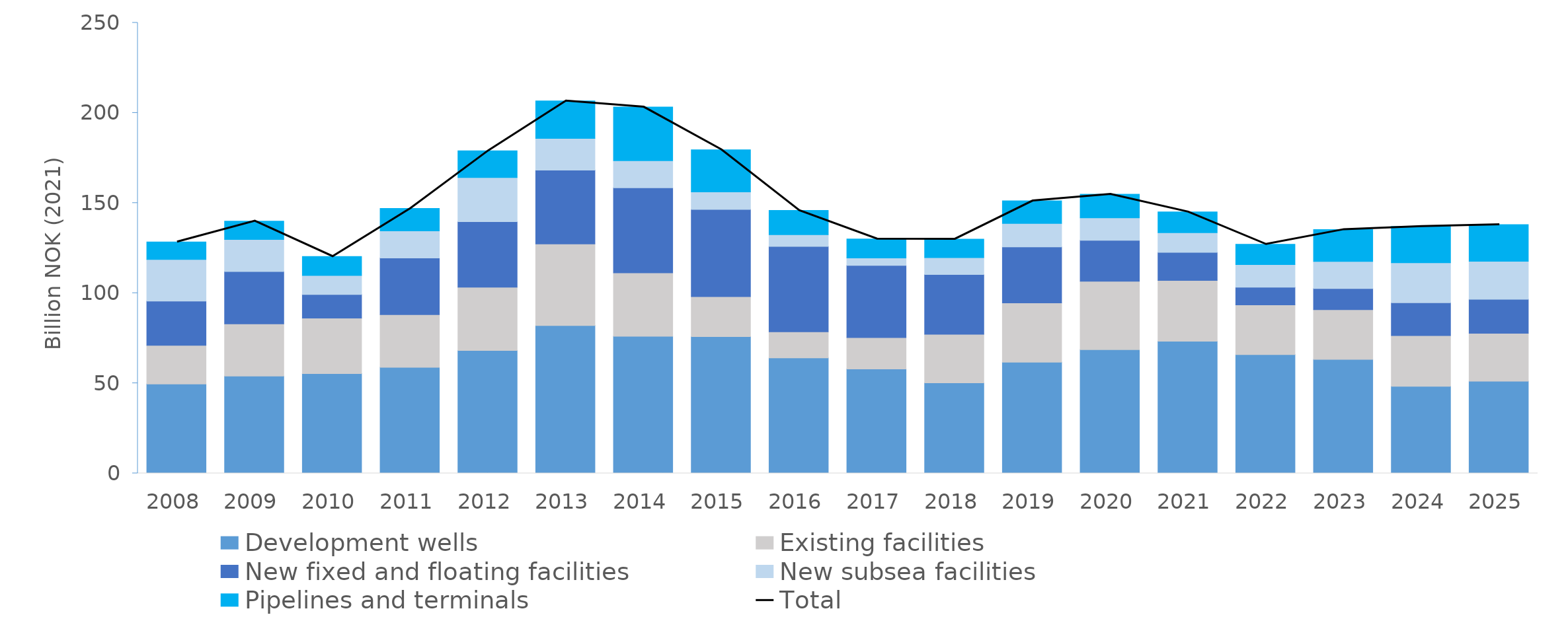
| Category | Development wells | Existing facilities | New fixed and floating facilities | New subsea facilities | Pipelines and terminals |
|---|---|---|---|---|---|
| 2008.0 | 49.567 | 21.442 | 24.59 | 23.072 | 9.741 |
| 2009.0 | 54.009 | 28.922 | 29.044 | 17.761 | 10.244 |
| 2010.0 | 55.353 | 30.83 | 13.045 | 10.534 | 10.584 |
| 2011.0 | 58.868 | 29.162 | 31.506 | 15.036 | 12.407 |
| 2012.0 | 68.156 | 35.168 | 36.314 | 24.491 | 14.892 |
| 2013.0 | 82.002 | 45.304 | 40.987 | 17.515 | 20.849 |
| 2014.0 | 76.103 | 35.179 | 47.174 | 15.045 | 29.733 |
| 2015.0 | 75.918 | 22.12 | 48.452 | 9.647 | 23.394 |
| 2016.0 | 64.028 | 14.534 | 47.344 | 6.509 | 13.456 |
| 2017.0 | 57.928 | 17.423 | 40.032 | 4.119 | 10.554 |
| 2018.0 | 50.246 | 26.929 | 33.177 | 9.308 | 10.321 |
| 2019.0 | 61.69 | 32.861 | 31.059 | 13.073 | 12.497 |
| 2020.0 | 68.667 | 37.915 | 22.731 | 12.475 | 13.114 |
| 2021.0 | 73.326 | 33.714 | 15.621 | 10.868 | 11.505 |
| 2022.0 | 65.932 | 27.514 | 9.853 | 12.542 | 11.254 |
| 2023.0 | 63.196 | 27.616 | 11.707 | 15.094 | 17.695 |
| 2024.0 | 48.338 | 28.069 | 18.223 | 22.221 | 20.176 |
| 2025.0 | 51.121 | 26.57 | 18.894 | 21.125 | 20.337 |